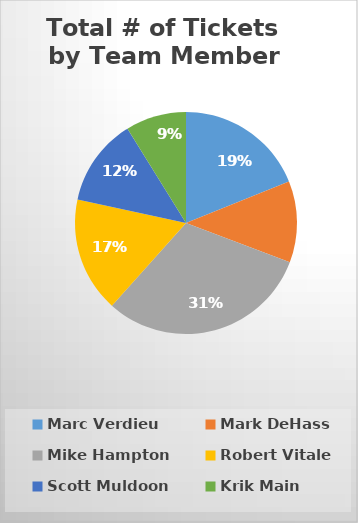
| Category | Series 0 |
|---|---|
| Marc Verdieu | 0.189 |
| Mark DeHass | 0.119 |
| Mike Hampton | 0.309 |
| Robert Vitale | 0.168 |
| Scott Muldoon | 0.128 |
| Krik Main | 0.088 |